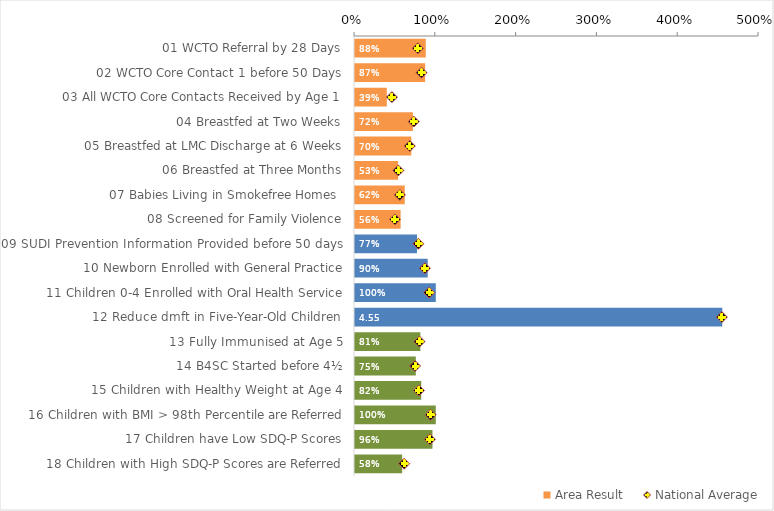
| Category | Area Result |
|---|---|
| 01 WCTO Referral by 28 Days | 0.876 |
| 02 WCTO Core Contact 1 before 50 Days | 0.868 |
| 03 All WCTO Core Contacts Received by Age 1 | 0.394 |
| 04 Breastfed at Two Weeks | 0.716 |
| 05 Breastfed at LMC Discharge at 6 Weeks | 0.696 |
| 06 Breastfed at Three Months | 0.534 |
| 07 Babies Living in Smokefree Homes  | 0.616 |
| 08 Screened for Family Violence | 0.565 |
| 09 SUDI Prevention Information Provided before 50 days | 0.768 |
| 10 Newborn Enrolled with General Practice | 0.9 |
| 11 Children 0-4 Enrolled with Oral Health Service | 1 |
| 12 Reduce dmft in Five-Year-Old Children | 4.546 |
| 13 Fully Immunised at Age 5 | 0.809 |
| 14 B4SC Started before 4½ | 0.752 |
| 15 Children with Healthy Weight at Age 4 | 0.82 |
| 16 Children with BMI > 98th Percentile are Referred | 1 |
| 17 Children have Low SDQ-P Scores | 0.959 |
| 18 Children with High SDQ-P Scores are Referred | 0.583 |